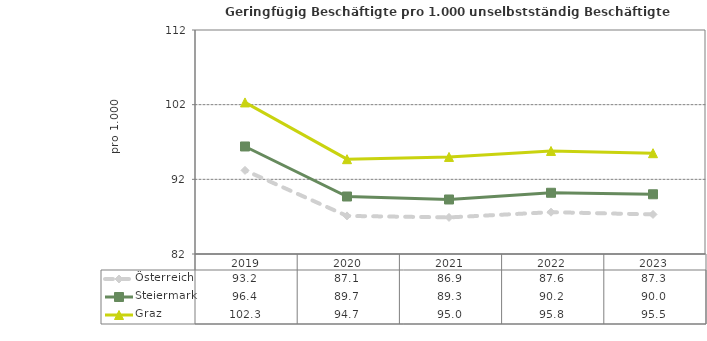
| Category | Österreich | Steiermark | Graz |
|---|---|---|---|
| 2023.0 | 87.3 | 90 | 95.5 |
| 2022.0 | 87.6 | 90.2 | 95.8 |
| 2021.0 | 86.9 | 89.3 | 95 |
| 2020.0 | 87.1 | 89.7 | 94.7 |
| 2019.0 | 93.2 | 96.4 | 102.3 |